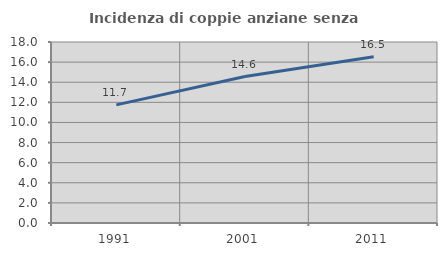
| Category | Incidenza di coppie anziane senza figli  |
|---|---|
| 1991.0 | 11.748 |
| 2001.0 | 14.56 |
| 2011.0 | 16.529 |